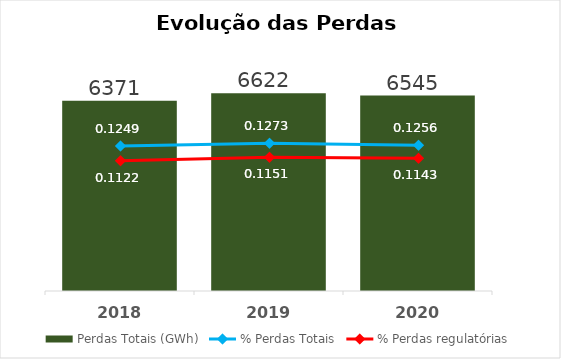
| Category | Perdas Totais (GWh) |
|---|---|
| 2018.0 | 6371 |
| 2019.0 | 6622 |
| 2020.0 | 6545 |